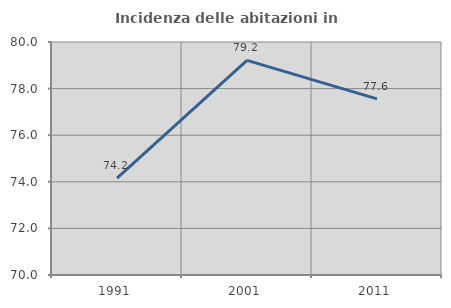
| Category | Incidenza delle abitazioni in proprietà  |
|---|---|
| 1991.0 | 74.161 |
| 2001.0 | 79.21 |
| 2011.0 | 77.56 |